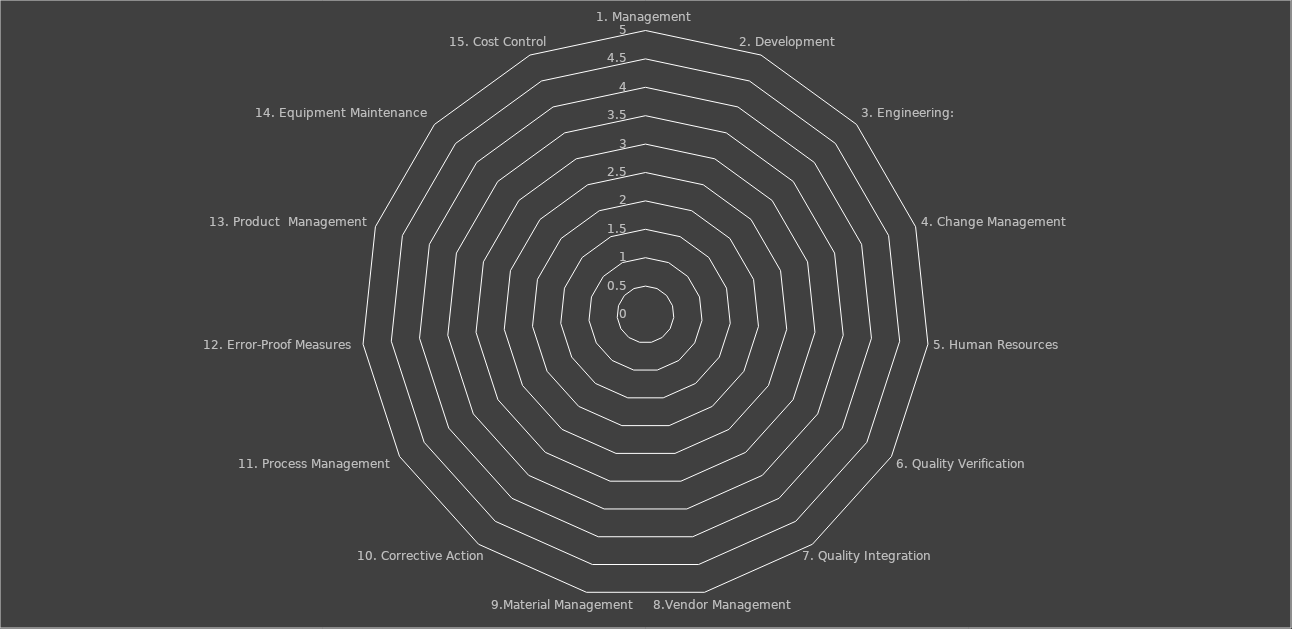
| Category | Series 0 | Series 1 | Series 2 | Series 3 | Series 4 |
|---|---|---|---|---|---|
| 1. Management |  |  |  |  | 0 |
| 2. Development |  |  |  |  | 0 |
| 3. Engineering: |  |  |  |  | 0 |
| 4. Change Management |  |  |  |  | 0 |
| 5. Human Resources |  |  |  |  | 0 |
| 6. Quality Verification |  |  |  |  | 0 |
| 7. Quality Integration |  |  |  |  | 0 |
| 8.Vendor Management |  |  |  |  | 0 |
| 9.Material Management |  |  |  |  | 0 |
| 10. Corrective Action |  |  |  |  | 0 |
| 11. Process Management |  |  |  |  | 0 |
| 12. Error-Proof Measures |  |  |  |  | 0 |
| 13. Product  Management |  |  |  |  | 0 |
| 14. Equipment Maintenance |  |  |  |  | 0 |
| 15. Cost Control |  |  |  |  | 0 |